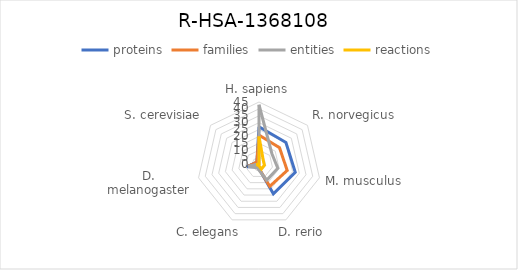
| Category | proteins | families | entities | reactions |
|---|---|---|---|---|
| H. sapiens | 27 | 21 | 43 | 20 |
| R. norvegicus | 25 | 19 | 12 | 4 |
| M. musculus | 27 | 21 | 14 | 4 |
| D. rerio | 24 | 18 | 13 | 4 |
| C. elegans | 2 | 2 | 3 | 1 |
| D. melanogaster | 9 | 8 | 8 | 2 |
| S. cerevisiae | 2 | 2 | 0 | 0 |